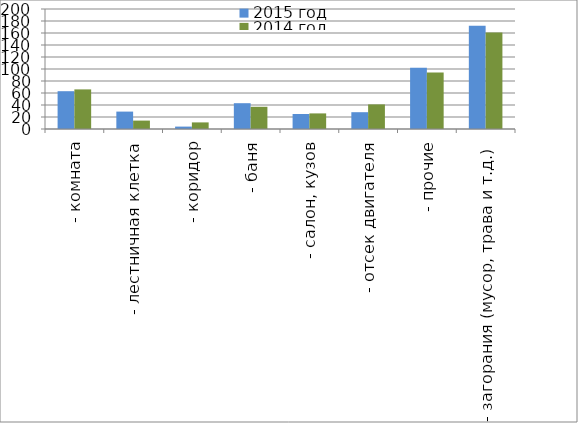
| Category | 2015 год | 2014 год |
|---|---|---|
|  - комната | 63 | 66 |
|  - лестничная клетка | 29 | 14 |
|  - коридор | 4 | 11 |
|  - баня | 43 | 37 |
|  - салон, кузов | 25 | 26 |
|  - отсек двигателя | 28 | 41 |
| - прочие | 102 | 94 |
| - загорания (мусор, трава и т.д.)  | 172 | 161 |